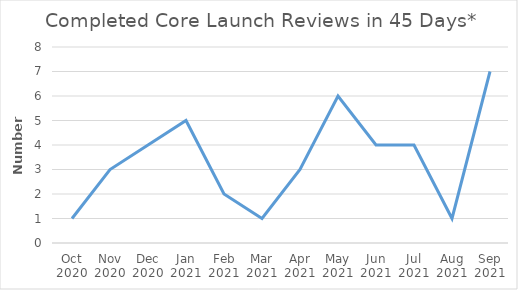
| Category | Number |
|---|---|
| Oct 2020 | 1 |
| Nov 2020 | 3 |
| Dec 2020 | 4 |
| Jan 2021 | 5 |
| Feb 2021 | 2 |
| Mar 2021 | 1 |
| Apr 2021 | 3 |
| May 2021 | 6 |
| Jun 2021 | 4 |
| Jul 2021 | 4 |
| Aug 2021 | 1 |
| Sep 2021 | 7 |